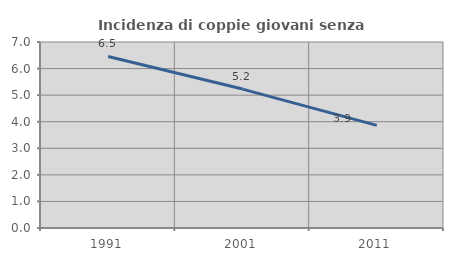
| Category | Incidenza di coppie giovani senza figli |
|---|---|
| 1991.0 | 6.455 |
| 2001.0 | 5.228 |
| 2011.0 | 3.862 |